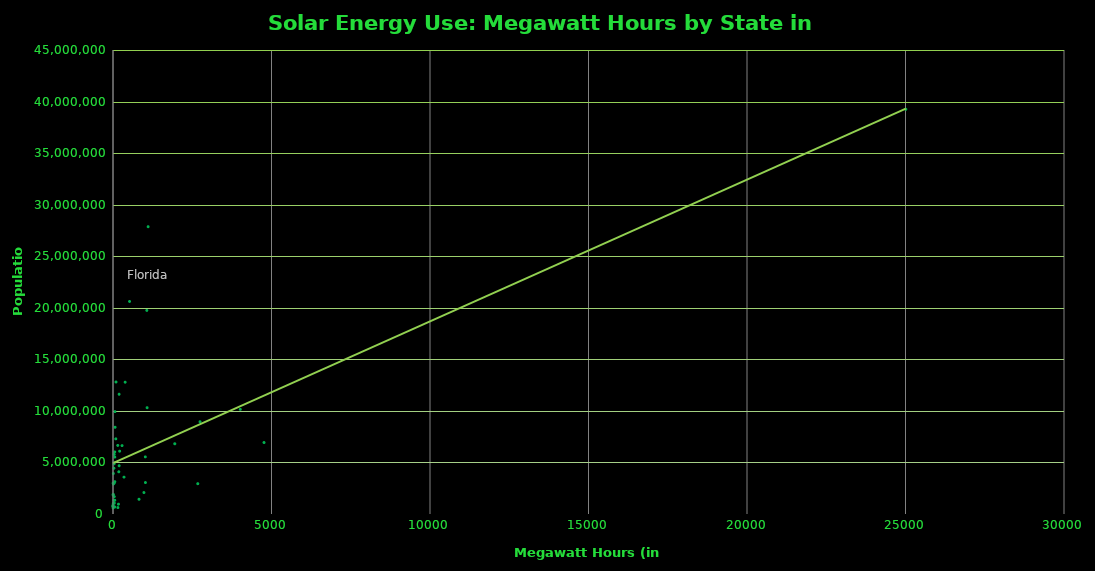
| Category | Population |
|---|---|
| 35.0 | 4863300 |
| 0.0 | 741894 |
| 4764.0 | 6931071 |
| 37.0 | 2988248 |
| 25011.0 | 39250017 |
| 1020.0 | 5540545 |
| 347.0 | 3576452 |
| 172.0 | 952065 |
| 54.0 | 681170 |
| 522.0 | 20612439 |
| 1076.0 | 10310371 |
| 821.0 | 1428557 |
| 39.0 | 1683140 |
| 95.0 | 12801539 |
| 285.0 | 6633053 |
| 56.0 | 3134693 |
| 12.0 | 2907289 |
| 29.0 | 4436974 |
| 194.0 | 4681666 |
| 29.0 | 1331479 |
| 54.0 | 6016447 |
| 1949.0 | 6811779 |
| 60.0 | 9928300 |
| 57.0 | 5519952 |
| 5.0 | 2988726 |
| 210.0 | 6093000 |
| 11.0 | 1042520 |
| 8.0 | 1907116 |
| 2674.0 | 2940058 |
| 54.0 | 1334795 |
| 2746.0 | 8944469 |
| 976.0 | 2081015 |
| 1067.0 | 19745289 |
| 4016.0 | 10146788 |
| 0.29 | 757952 |
| 193.0 | 11614373 |
| 11.0 | 3923561 |
| 183.0 | 4093465 |
| 383.0 | 12784227 |
| 41.0 | 1056426 |
| 35.0 | 4961119 |
| 2.0 | 865454 |
| 151.0 | 6651194 |
| 1108.0 | 27862596 |
| 1023.0 | 3051217 |
| 155.0 | 624594 |
| 65.0 | 8411808 |
| 89.0 | 7288000 |
| 6.0 | 1831102 |
| 38.0 | 5778708 |
| 3.0 | 585501 |